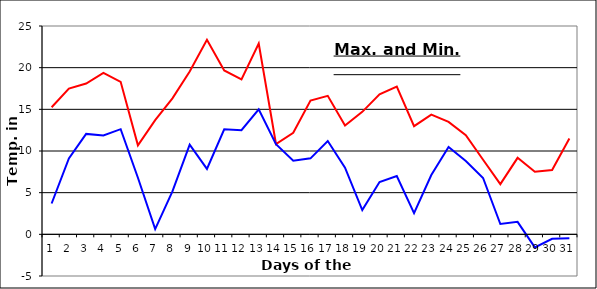
| Category | Series 0 | Series 1 |
|---|---|---|
| 0 | 15.25 | 3.7 |
| 1 | 17.48 | 9.11 |
| 2 | 18.1 | 12.05 |
| 3 | 19.38 | 11.87 |
| 4 | 18.3 | 12.62 |
| 5 | 10.68 | 6.79 |
| 6 | 13.7 | 0.63 |
| 7 | 16.32 | 5.15 |
| 8 | 19.53 | 10.77 |
| 9 | 23.35 | 7.85 |
| 10 | 19.66 | 12.61 |
| 11 | 18.6 | 12.49 |
| 12 | 22.9 | 15 |
| 13 | 10.84 | 10.81 |
| 14 | 12.18 | 8.83 |
| 15 | 16.05 | 9.12 |
| 16 | 16.62 | 11.2 |
| 17 | 13.07 | 8 |
| 18 | 14.7 | 2.91 |
| 19 | 16.8 | 6.27 |
| 20 | 17.73 | 6.99 |
| 21 | 12.98 | 2.55 |
| 22 | 14.36 | 7.12 |
| 23 | 13.49 | 10.48 |
| 24 | 11.9 | 8.8 |
| 25 | 8.95 | 6.76 |
| 26 | 6.02 | 1.24 |
| 27 | 9.18 | 1.5 |
| 28 | 7.52 | -1.57 |
| 29 | 7.72 | -0.53 |
| 30 | 11.5 | -0.46 |